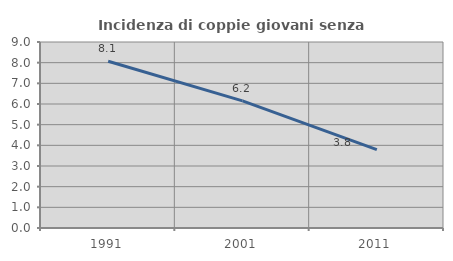
| Category | Incidenza di coppie giovani senza figli |
|---|---|
| 1991.0 | 8.068 |
| 2001.0 | 6.15 |
| 2011.0 | 3.796 |